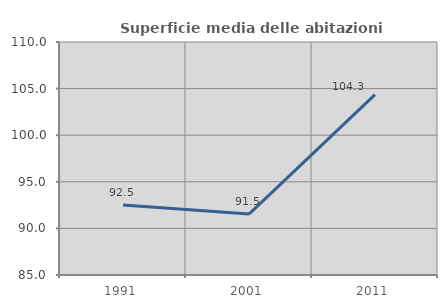
| Category | Superficie media delle abitazioni occupate |
|---|---|
| 1991.0 | 92.506 |
| 2001.0 | 91.534 |
| 2011.0 | 104.348 |